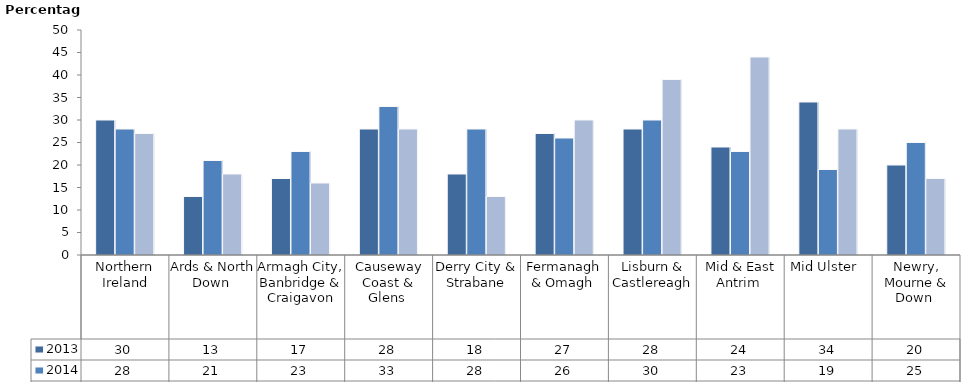
| Category | 2013 | 2014 | 2015 |
|---|---|---|---|
| Northern Ireland | 30 | 28 | 27 |
| Ards & North Down  | 13 | 21 | 18 |
| Armagh City, Banbridge & Craigavon | 17 | 23 | 16 |
| Causeway Coast & Glens  | 28 | 33 | 28 |
| Derry City & Strabane | 18 | 28 | 13 |
| Fermanagh & Omagh  | 27 | 26 | 30 |
| Lisburn & Castlereagh | 28 | 30 | 39 |
| Mid & East Antrim  | 24 | 23 | 44 |
| Mid Ulster  | 34 | 19 | 28 |
| Newry, Mourne & Down  | 20 | 25 | 17 |